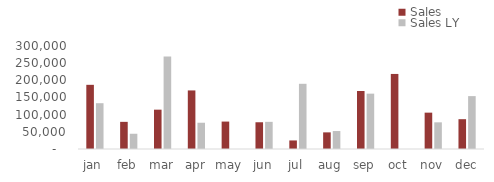
| Category | Sales | Sales LY |
|---|---|---|
| jan | 186911.095 | 133375.44 |
| feb | 79070.97 | 44400.72 |
| mar | 114559.425 | 269571.7 |
| apr | 170588.46 | 76510.65 |
| may | 79879.915 | 0 |
| jun | 77889.82 | 79085.9 |
| jul | 24907.885 | 189901.2 |
| aug | 48444.87 | 52321.44 |
| sep | 168869.685 | 161221.77 |
| oct | 218616.327 | 0 |
| nov | 105881.054 | 77701.26 |
| dec | 86838.36 | 154066.22 |